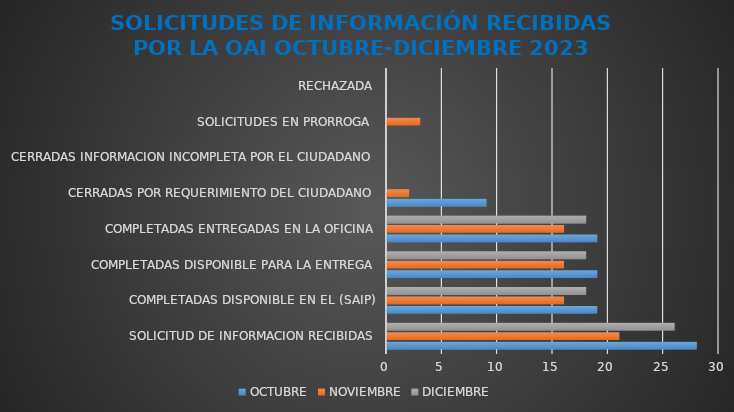
| Category | OCTUBRE | NOVIEMBRE | DICIEMBRE |
|---|---|---|---|
| SOLICITUD DE INFORMACION RECIBIDAS | 28 | 21 | 26 |
| COMPLETADAS DISPONIBLE EN EL (SAIP) | 19 | 16 | 18 |
| COMPLETADAS DISPONIBLE PARA LA ENTREGA | 19 | 16 | 18 |
| COMPLETADAS ENTREGADAS EN LA OFICINA | 19 | 16 | 18 |
| CERRADAS POR REQUERIMIENTO DEL CIUDADANO | 9 | 2 | 0 |
| CERRADAS INFORMACION INCOMPLETA POR EL CIUDADANO | 0 | 0 | 0 |
| SOLICITUDES EN PRORROGA  | 0 | 3 | 0 |
| RECHAZADA | 0 | 0 | 0 |